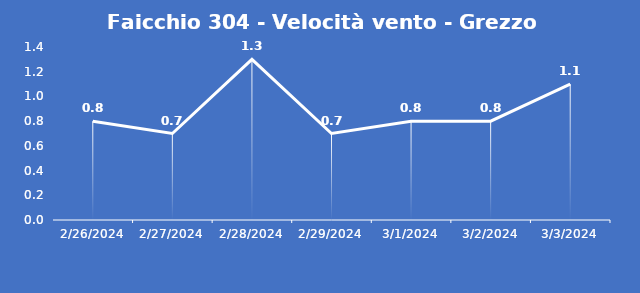
| Category | Faicchio 304 - Velocità vento - Grezzo (m/s) |
|---|---|
| 2/26/24 | 0.8 |
| 2/27/24 | 0.7 |
| 2/28/24 | 1.3 |
| 2/29/24 | 0.7 |
| 3/1/24 | 0.8 |
| 3/2/24 | 0.8 |
| 3/3/24 | 1.1 |